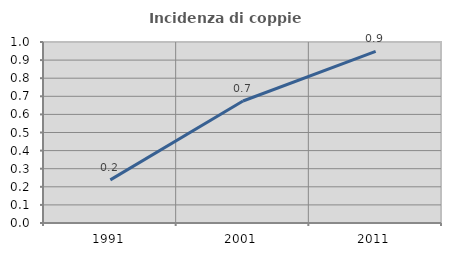
| Category | Incidenza di coppie miste |
|---|---|
| 1991.0 | 0.238 |
| 2001.0 | 0.674 |
| 2011.0 | 0.948 |